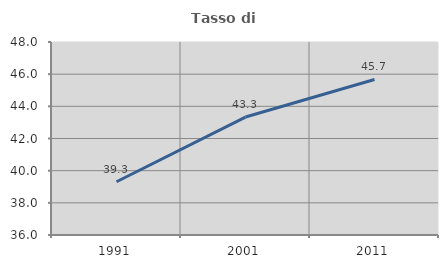
| Category | Tasso di occupazione   |
|---|---|
| 1991.0 | 39.311 |
| 2001.0 | 43.335 |
| 2011.0 | 45.672 |